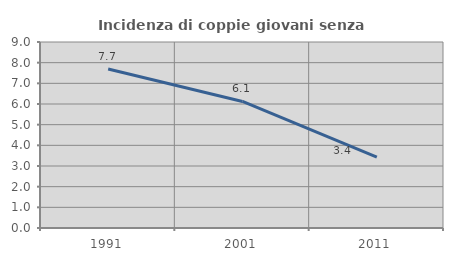
| Category | Incidenza di coppie giovani senza figli |
|---|---|
| 1991.0 | 7.692 |
| 2001.0 | 6.122 |
| 2011.0 | 3.426 |